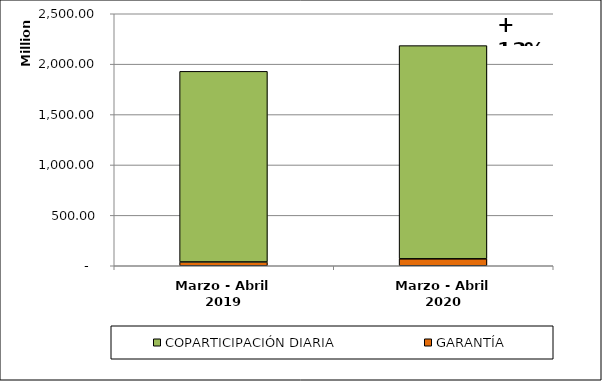
| Category | GARANTÍA | COPARTICIPACIÓN DIARIA |
|---|---|---|
| Marzo - Abril 2019 | 37541044.23 | 1891110765.32 |
| Marzo - Abril 2020 | 68801999.2 | 2115260909.31 |